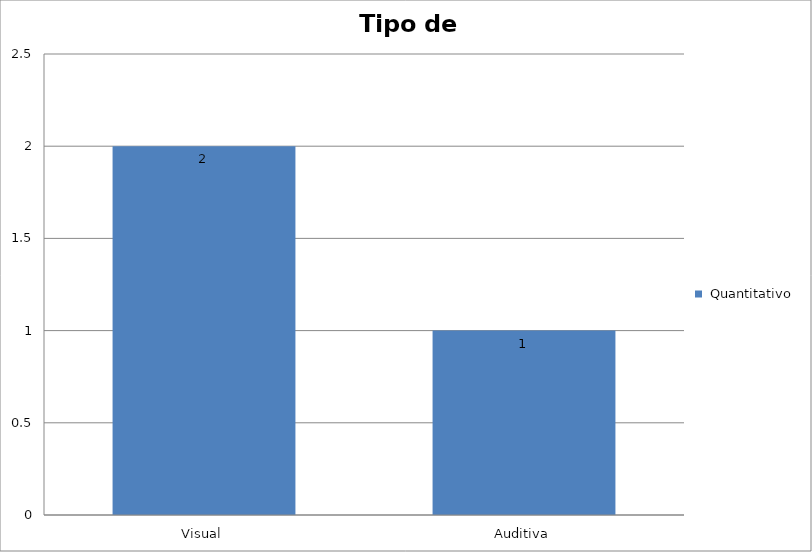
| Category |  Quantitativo |
|---|---|
| Visual | 2 |
| Auditiva | 1 |